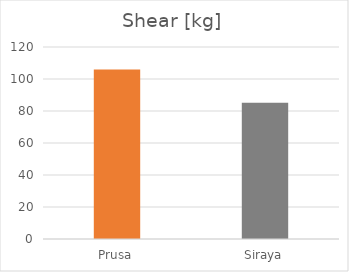
| Category | Shear [kg] |
|---|---|
| Prusa | 105.9 |
| Siraya | 85.1 |